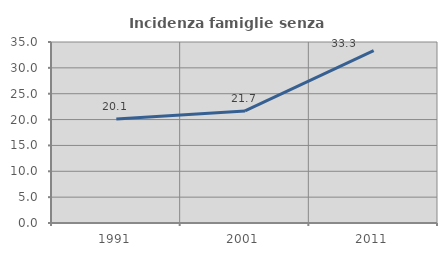
| Category | Incidenza famiglie senza nuclei |
|---|---|
| 1991.0 | 20.121 |
| 2001.0 | 21.663 |
| 2011.0 | 33.333 |